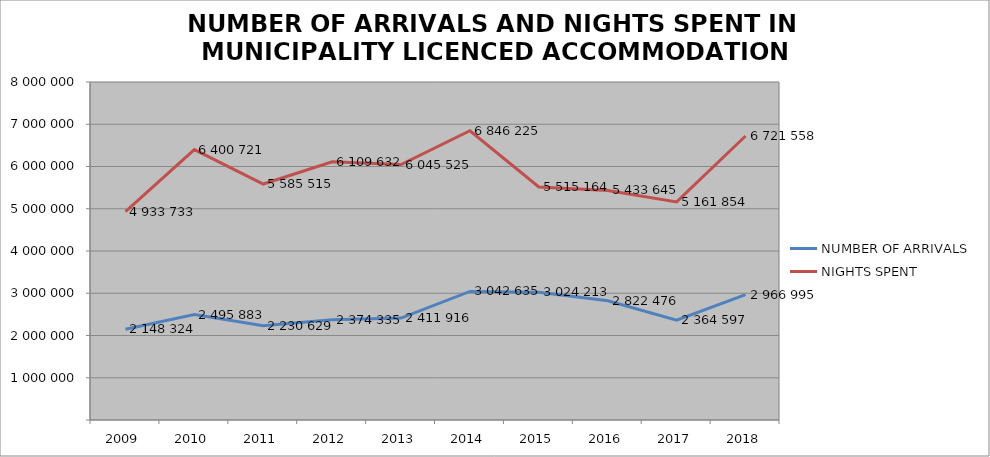
| Category | NUMBER OF ARRIVALS | NIGHTS SPENT |
|---|---|---|
| 2009 | 2148324 | 4933733 |
| 2010 | 2495883 | 6400721 |
| 2011 | 2230629 | 5585515 |
| 2012 | 2374335 | 6109632 |
| 2013 | 2411916 | 6045525 |
| 2014 | 3042635 | 6846225 |
| 2015 | 3024213 | 5515164 |
| 2016 | 2822476 | 5433645 |
| 2017 | 2364597 | 5161854 |
| 2018 | 2966995 | 6721558 |